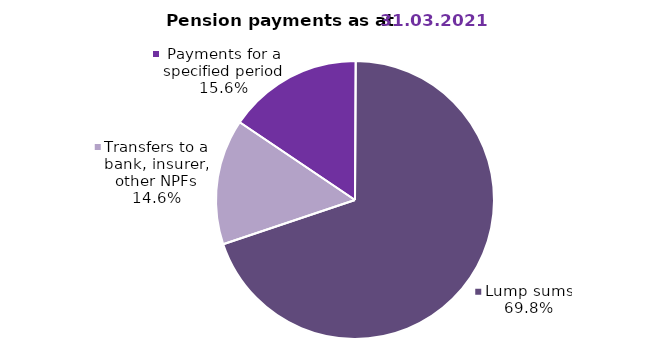
| Category | Series 0 |
|---|---|
| Payments for a specified period | 80.362 |
| Lump sums | 358.484 |
| Transfers to a bank, insurer, other NPFs | 75.03 |